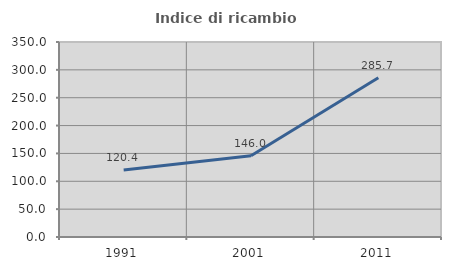
| Category | Indice di ricambio occupazionale  |
|---|---|
| 1991.0 | 120.44 |
| 2001.0 | 145.979 |
| 2011.0 | 285.714 |